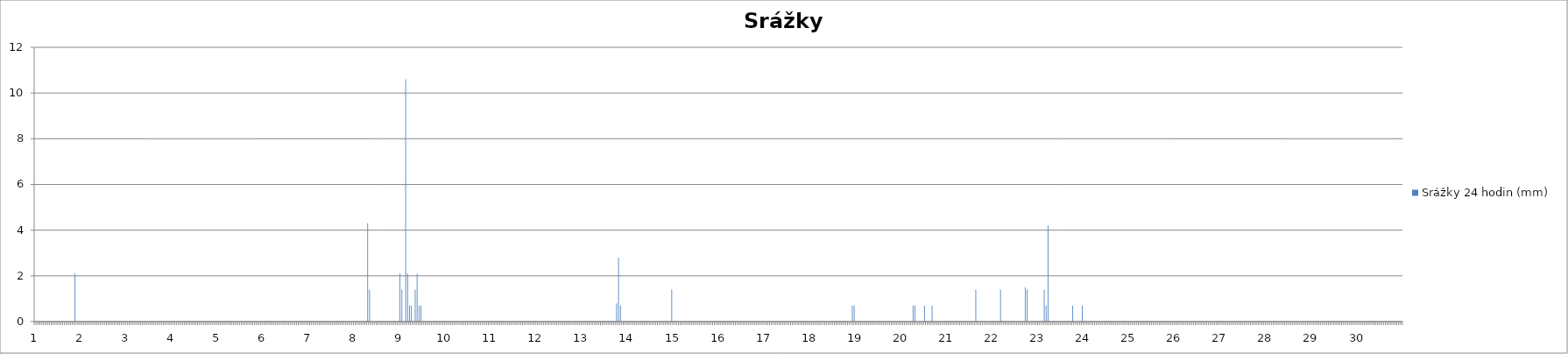
| Category | Srážky 24 hodin (mm) |
|---|---|
| 0 | 0 |
| 1 | 0 |
| 2 | 0 |
| 3 | 0 |
| 4 | 0 |
| 5 | 0 |
| 6 | 0 |
| 7 | 0 |
| 8 | 0 |
| 9 | 0 |
| 10 | 0 |
| 11 | 0 |
| 12 | 0 |
| 13 | 0 |
| 14 | 0 |
| 15 | 0 |
| 16 | 0 |
| 17 | 0 |
| 18 | 0 |
| 19 | 0 |
| 20 | 0 |
| 21 | 2.1 |
| 22 | 0 |
| 23 | 0 |
| 24 | 0 |
| 25 | 0 |
| 26 | 0 |
| 27 | 0 |
| 28 | 0 |
| 29 | 0 |
| 30 | 0 |
| 31 | 0 |
| 32 | 0 |
| 33 | 0 |
| 34 | 0 |
| 35 | 0 |
| 36 | 0 |
| 37 | 0 |
| 38 | 0 |
| 39 | 0 |
| 40 | 0 |
| 41 | 0 |
| 42 | 0 |
| 43 | 0 |
| 44 | 0 |
| 45 | 0 |
| 46 | 0 |
| 47 | 0 |
| 48 | 0 |
| 49 | 0 |
| 50 | 0 |
| 51 | 0 |
| 52 | 0 |
| 53 | 0 |
| 54 | 0 |
| 55 | 0 |
| 56 | 0 |
| 57 | 0 |
| 58 | 0 |
| 59 | 0 |
| 60 | 0 |
| 61 | 0 |
| 62 | 0 |
| 63 | 0 |
| 64 | 0 |
| 65 | 0 |
| 66 | 0 |
| 67 | 0 |
| 68 | 0 |
| 69 | 0 |
| 70 | 0 |
| 71 | 0 |
| 72 | 0 |
| 73 | 0 |
| 74 | 0 |
| 75 | 0 |
| 76 | 0 |
| 77 | 0 |
| 78 | 0 |
| 79 | 0 |
| 80 | 0 |
| 81 | 0 |
| 82 | 0 |
| 83 | 0 |
| 84 | 0 |
| 85 | 0 |
| 86 | 0 |
| 87 | 0 |
| 88 | 0 |
| 89 | 0 |
| 90 | 0 |
| 91 | 0 |
| 92 | 0 |
| 93 | 0 |
| 94 | 0 |
| 95 | 0 |
| 96 | 0 |
| 97 | 0 |
| 98 | 0 |
| 99 | 0 |
| 100 | 0 |
| 101 | 0 |
| 102 | 0 |
| 103 | 0 |
| 104 | 0 |
| 105 | 0 |
| 106 | 0 |
| 107 | 0 |
| 108 | 0 |
| 109 | 0 |
| 110 | 0 |
| 111 | 0 |
| 112 | 0 |
| 113 | 0 |
| 114 | 0 |
| 115 | 0 |
| 116 | 0 |
| 117 | 0 |
| 118 | 0 |
| 119 | 0 |
| 120 | 0 |
| 121 | 0 |
| 122 | 0 |
| 123 | 0 |
| 124 | 0 |
| 125 | 0 |
| 126 | 0 |
| 127 | 0 |
| 128 | 0 |
| 129 | 0 |
| 130 | 0 |
| 131 | 0 |
| 132 | 0 |
| 133 | 0 |
| 134 | 0 |
| 135 | 0 |
| 136 | 0 |
| 137 | 0 |
| 138 | 0 |
| 139 | 0 |
| 140 | 0 |
| 141 | 0 |
| 142 | 0 |
| 143 | 0 |
| 144 | 0 |
| 145 | 0 |
| 146 | 0 |
| 147 | 0 |
| 148 | 0 |
| 149 | 0 |
| 150 | 0 |
| 151 | 0 |
| 152 | 0 |
| 153 | 0 |
| 154 | 0 |
| 155 | 0 |
| 156 | 0 |
| 157 | 0 |
| 158 | 0 |
| 159 | 0 |
| 160 | 0 |
| 161 | 0 |
| 162 | 0 |
| 163 | 0 |
| 164 | 0 |
| 165 | 0 |
| 166 | 0 |
| 167 | 0 |
| 168 | 0 |
| 169 | 0 |
| 170 | 0 |
| 171 | 0 |
| 172 | 0 |
| 173 | 0 |
| 174 | 0 |
| 175 | 4.3 |
| 176 | 1.4 |
| 177 | 0 |
| 178 | 0 |
| 179 | 0 |
| 180 | 0 |
| 181 | 0 |
| 182 | 0 |
| 183 | 0 |
| 184 | 0 |
| 185 | 0 |
| 186 | 0 |
| 187 | 0 |
| 188 | 0 |
| 189 | 0 |
| 190 | 0 |
| 191 | 0 |
| 192 | 2.1 |
| 193 | 1.4 |
| 194 | 0 |
| 195 | 10.6 |
| 196 | 2.1 |
| 197 | 0.7 |
| 198 | 0.7 |
| 199 | 0 |
| 200 | 1.4 |
| 201 | 2.1 |
| 202 | 0.7 |
| 203 | 0.7 |
| 204 | 0 |
| 205 | 0 |
| 206 | 0 |
| 207 | 0 |
| 208 | 0 |
| 209 | 0 |
| 210 | 0 |
| 211 | 0 |
| 212 | 0 |
| 213 | 0 |
| 214 | 0 |
| 215 | 0 |
| 216 | 0 |
| 217 | 0 |
| 218 | 0 |
| 219 | 0 |
| 220 | 0 |
| 221 | 0 |
| 222 | 0 |
| 223 | 0 |
| 224 | 0 |
| 225 | 0 |
| 226 | 0 |
| 227 | 0 |
| 228 | 0 |
| 229 | 0 |
| 230 | 0 |
| 231 | 0 |
| 232 | 0 |
| 233 | 0 |
| 234 | 0 |
| 235 | 0 |
| 236 | 0 |
| 237 | 0 |
| 238 | 0 |
| 239 | 0 |
| 240 | 0 |
| 241 | 0 |
| 242 | 0 |
| 243 | 0 |
| 244 | 0 |
| 245 | 0 |
| 246 | 0 |
| 247 | 0 |
| 248 | 0 |
| 249 | 0 |
| 250 | 0 |
| 251 | 0 |
| 252 | 0 |
| 253 | 0 |
| 254 | 0 |
| 255 | 0 |
| 256 | 0 |
| 257 | 0 |
| 258 | 0 |
| 259 | 0 |
| 260 | 0 |
| 261 | 0 |
| 262 | 0 |
| 263 | 0 |
| 264 | 0 |
| 265 | 0 |
| 266 | 0 |
| 267 | 0 |
| 268 | 0 |
| 269 | 0 |
| 270 | 0 |
| 271 | 0 |
| 272 | 0 |
| 273 | 0 |
| 274 | 0 |
| 275 | 0 |
| 276 | 0 |
| 277 | 0 |
| 278 | 0 |
| 279 | 0 |
| 280 | 0 |
| 281 | 0 |
| 282 | 0 |
| 283 | 0 |
| 284 | 0 |
| 285 | 0 |
| 286 | 0 |
| 287 | 0 |
| 288 | 0 |
| 289 | 0 |
| 290 | 0 |
| 291 | 0 |
| 292 | 0 |
| 293 | 0 |
| 294 | 0 |
| 295 | 0 |
| 296 | 0 |
| 297 | 0 |
| 298 | 0 |
| 299 | 0 |
| 300 | 0 |
| 301 | 0 |
| 302 | 0 |
| 303 | 0 |
| 304 | 0 |
| 305 | 0 |
| 306 | 0.8 |
| 307 | 2.8 |
| 308 | 0.7 |
| 309 | 0 |
| 310 | 0 |
| 311 | 0 |
| 312 | 0 |
| 313 | 0 |
| 314 | 0 |
| 315 | 0 |
| 316 | 0 |
| 317 | 0 |
| 318 | 0 |
| 319 | 0 |
| 320 | 0 |
| 321 | 0 |
| 322 | 0 |
| 323 | 0 |
| 324 | 0 |
| 325 | 0 |
| 326 | 0 |
| 327 | 0 |
| 328 | 0 |
| 329 | 0 |
| 330 | 0 |
| 331 | 0 |
| 332 | 0 |
| 333 | 0 |
| 334 | 0 |
| 335 | 1.4 |
| 336 | 0 |
| 337 | 0 |
| 338 | 0 |
| 339 | 0 |
| 340 | 0 |
| 341 | 0 |
| 342 | 0 |
| 343 | 0 |
| 344 | 0 |
| 345 | 0 |
| 346 | 0 |
| 347 | 0 |
| 348 | 0 |
| 349 | 0 |
| 350 | 0 |
| 351 | 0 |
| 352 | 0 |
| 353 | 0 |
| 354 | 0 |
| 355 | 0 |
| 356 | 0 |
| 357 | 0 |
| 358 | 0 |
| 359 | 0 |
| 360 | 0 |
| 361 | 0 |
| 362 | 0 |
| 363 | 0 |
| 364 | 0 |
| 365 | 0 |
| 366 | 0 |
| 367 | 0 |
| 368 | 0 |
| 369 | 0 |
| 370 | 0 |
| 371 | 0 |
| 372 | 0 |
| 373 | 0 |
| 374 | 0 |
| 375 | 0 |
| 376 | 0 |
| 377 | 0 |
| 378 | 0 |
| 379 | 0 |
| 380 | 0 |
| 381 | 0 |
| 382 | 0 |
| 383 | 0 |
| 384 | 0 |
| 385 | 0 |
| 386 | 0 |
| 387 | 0 |
| 388 | 0 |
| 389 | 0 |
| 390 | 0 |
| 391 | 0 |
| 392 | 0 |
| 393 | 0 |
| 394 | 0 |
| 395 | 0 |
| 396 | 0 |
| 397 | 0 |
| 398 | 0 |
| 399 | 0 |
| 400 | 0 |
| 401 | 0 |
| 402 | 0 |
| 403 | 0 |
| 404 | 0 |
| 405 | 0 |
| 406 | 0 |
| 407 | 0 |
| 408 | 0 |
| 409 | 0 |
| 410 | 0 |
| 411 | 0 |
| 412 | 0 |
| 413 | 0 |
| 414 | 0 |
| 415 | 0 |
| 416 | 0 |
| 417 | 0 |
| 418 | 0 |
| 419 | 0 |
| 420 | 0 |
| 421 | 0 |
| 422 | 0 |
| 423 | 0 |
| 424 | 0 |
| 425 | 0 |
| 426 | 0 |
| 427 | 0 |
| 428 | 0 |
| 429 | 0 |
| 430 | 0.7 |
| 431 | 0.7 |
| 432 | 0 |
| 433 | 0 |
| 434 | 0 |
| 435 | 0 |
| 436 | 0 |
| 437 | 0 |
| 438 | 0 |
| 439 | 0 |
| 440 | 0 |
| 441 | 0 |
| 442 | 0 |
| 443 | 0 |
| 444 | 0 |
| 445 | 0 |
| 446 | 0 |
| 447 | 0 |
| 448 | 0 |
| 449 | 0 |
| 450 | 0 |
| 451 | 0 |
| 452 | 0 |
| 453 | 0 |
| 454 | 0 |
| 455 | 0 |
| 456 | 0 |
| 457 | 0 |
| 458 | 0 |
| 459 | 0 |
| 460 | 0 |
| 461 | 0 |
| 462 | 0.7 |
| 463 | 0.7 |
| 464 | 0 |
| 465 | 0 |
| 466 | 0 |
| 467 | 0 |
| 468 | 0.7 |
| 469 | 0 |
| 470 | 0 |
| 471 | 0 |
| 472 | 0.7 |
| 473 | 0 |
| 474 | 0 |
| 475 | 0 |
| 476 | 0 |
| 477 | 0 |
| 478 | 0 |
| 479 | 0 |
| 480 | 0 |
| 481 | 0 |
| 482 | 0 |
| 483 | 0 |
| 484 | 0 |
| 485 | 0 |
| 486 | 0 |
| 487 | 0 |
| 488 | 0 |
| 489 | 0 |
| 490 | 0 |
| 491 | 0 |
| 492 | 0 |
| 493 | 0 |
| 494 | 0 |
| 495 | 1.4 |
| 496 | 0 |
| 497 | 0 |
| 498 | 0 |
| 499 | 0 |
| 500 | 0 |
| 501 | 0 |
| 502 | 0 |
| 503 | 0 |
| 504 | 0 |
| 505 | 0 |
| 506 | 0 |
| 507 | 0 |
| 508 | 1.4 |
| 509 | 0 |
| 510 | 0 |
| 511 | 0 |
| 512 | 0 |
| 513 | 0 |
| 514 | 0 |
| 515 | 0 |
| 516 | 0 |
| 517 | 0 |
| 518 | 0 |
| 519 | 0 |
| 520 | 0 |
| 521 | 1.5 |
| 522 | 1.4 |
| 523 | 0 |
| 524 | 0 |
| 525 | 0 |
| 526 | 0 |
| 527 | 0 |
| 528 | 0 |
| 529 | 0 |
| 530 | 0 |
| 531 | 1.4 |
| 532 | 0.7 |
| 533 | 4.2 |
| 534 | 0 |
| 535 | 0 |
| 536 | 0 |
| 537 | 0 |
| 538 | 0 |
| 539 | 0 |
| 540 | 0 |
| 541 | 0 |
| 542 | 0 |
| 543 | 0 |
| 544 | 0 |
| 545 | 0 |
| 546 | 0.7 |
| 547 | 0 |
| 548 | 0 |
| 549 | 0 |
| 550 | 0 |
| 551 | 0.7 |
| 552 | 0 |
| 553 | 0 |
| 554 | 0 |
| 555 | 0 |
| 556 | 0 |
| 557 | 0 |
| 558 | 0 |
| 559 | 0 |
| 560 | 0 |
| 561 | 0 |
| 562 | 0 |
| 563 | 0 |
| 564 | 0 |
| 565 | 0 |
| 566 | 0 |
| 567 | 0 |
| 568 | 0 |
| 569 | 0 |
| 570 | 0 |
| 571 | 0 |
| 572 | 0 |
| 573 | 0 |
| 574 | 0 |
| 575 | 0 |
| 576 | 0 |
| 577 | 0 |
| 578 | 0 |
| 579 | 0 |
| 580 | 0 |
| 581 | 0 |
| 582 | 0 |
| 583 | 0 |
| 584 | 0 |
| 585 | 0 |
| 586 | 0 |
| 587 | 0 |
| 588 | 0 |
| 589 | 0 |
| 590 | 0 |
| 591 | 0 |
| 592 | 0 |
| 593 | 0 |
| 594 | 0 |
| 595 | 0 |
| 596 | 0 |
| 597 | 0 |
| 598 | 0 |
| 599 | 0 |
| 600 | 0 |
| 601 | 0 |
| 602 | 0 |
| 603 | 0 |
| 604 | 0 |
| 605 | 0 |
| 606 | 0 |
| 607 | 0 |
| 608 | 0 |
| 609 | 0 |
| 610 | 0 |
| 611 | 0 |
| 612 | 0 |
| 613 | 0 |
| 614 | 0 |
| 615 | 0 |
| 616 | 0 |
| 617 | 0 |
| 618 | 0 |
| 619 | 0 |
| 620 | 0 |
| 621 | 0 |
| 622 | 0 |
| 623 | 0 |
| 624 | 0 |
| 625 | 0 |
| 626 | 0 |
| 627 | 0 |
| 628 | 0 |
| 629 | 0 |
| 630 | 0 |
| 631 | 0 |
| 632 | 0 |
| 633 | 0 |
| 634 | 0 |
| 635 | 0 |
| 636 | 0 |
| 637 | 0 |
| 638 | 0 |
| 639 | 0 |
| 640 | 0 |
| 641 | 0 |
| 642 | 0 |
| 643 | 0 |
| 644 | 0 |
| 645 | 0 |
| 646 | 0 |
| 647 | 0 |
| 648 | 0 |
| 649 | 0 |
| 650 | 0 |
| 651 | 0 |
| 652 | 0 |
| 653 | 0 |
| 654 | 0 |
| 655 | 0 |
| 656 | 0 |
| 657 | 0 |
| 658 | 0 |
| 659 | 0 |
| 660 | 0 |
| 661 | 0 |
| 662 | 0 |
| 663 | 0 |
| 664 | 0 |
| 665 | 0 |
| 666 | 0 |
| 667 | 0 |
| 668 | 0 |
| 669 | 0 |
| 670 | 0 |
| 671 | 0 |
| 672 | 0 |
| 673 | 0 |
| 674 | 0 |
| 675 | 0 |
| 676 | 0 |
| 677 | 0 |
| 678 | 0 |
| 679 | 0 |
| 680 | 0 |
| 681 | 0 |
| 682 | 0 |
| 683 | 0 |
| 684 | 0 |
| 685 | 0 |
| 686 | 0 |
| 687 | 0 |
| 688 | 0 |
| 689 | 0 |
| 690 | 0 |
| 691 | 0 |
| 692 | 0 |
| 693 | 0 |
| 694 | 0 |
| 695 | 0 |
| 696 | 0 |
| 697 | 0 |
| 698 | 0 |
| 699 | 0 |
| 700 | 0 |
| 701 | 0 |
| 702 | 0 |
| 703 | 0 |
| 704 | 0 |
| 705 | 0 |
| 706 | 0 |
| 707 | 0 |
| 708 | 0 |
| 709 | 0 |
| 710 | 0 |
| 711 | 0 |
| 712 | 0 |
| 713 | 0 |
| 714 | 0 |
| 715 | 0 |
| 716 | 0 |
| 717 | 0 |
| 718 | 0 |
| 719 | 0 |